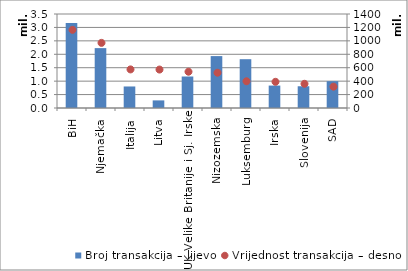
| Category | Broj transakcija – lijevo |
|---|---|
| BiH | 3165454 |
| Njemačka | 2229581 |
| Italija | 801497 |
| Litva | 283188 |
| UK Velike Britanije i Sj. Irske | 1172522 |
| Nizozemska | 1932698 |
| Luksemburg | 1817101 |
| Irska | 835068 |
| Slovenija | 809600 |
| SAD | 999407 |